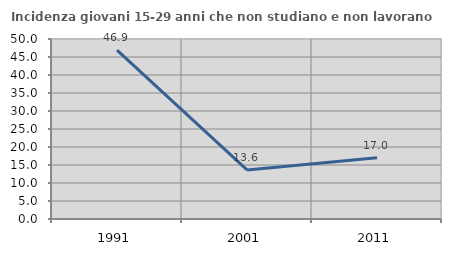
| Category | Incidenza giovani 15-29 anni che non studiano e non lavorano  |
|---|---|
| 1991.0 | 46.903 |
| 2001.0 | 13.636 |
| 2011.0 | 16.981 |